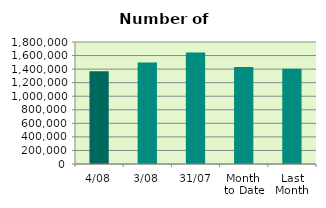
| Category | Series 0 |
|---|---|
| 4/08 | 1368332 |
| 3/08 | 1496938 |
| 31/07 | 1646042 |
| Month 
to Date | 1432635 |
| Last
Month | 1404253.739 |